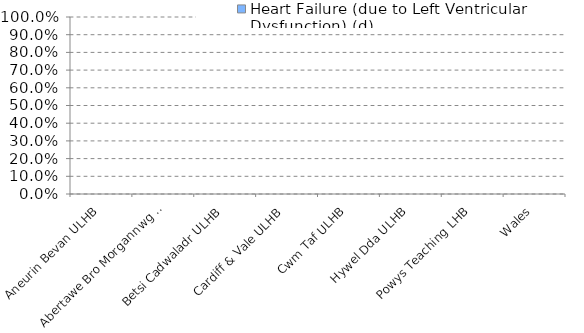
| Category | Heart Failure (due to Left Ventricular Dysfunction) (d) |
|---|---|
| Aneurin Bevan ULHB | 0 |
| Abertawe Bro Morgannwg ULHB | 0 |
| Betsi Cadwaladr ULHB | 0 |
| Cardiff & Vale ULHB | 0 |
| Cwm Taf ULHB | 0 |
| Hywel Dda ULHB | 0 |
| Powys Teaching LHB | 0 |
| Wales | 0 |